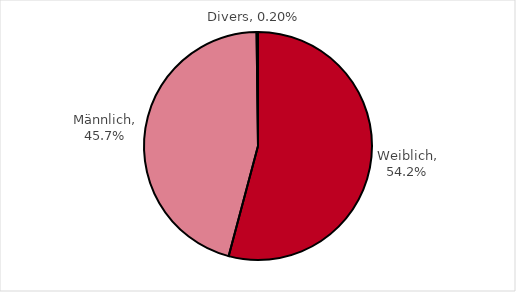
| Category | Series 0 |
|---|---|
| Weiblich | 0.542 |
| Männlich | 0.457 |
| Divers | 0.002 |